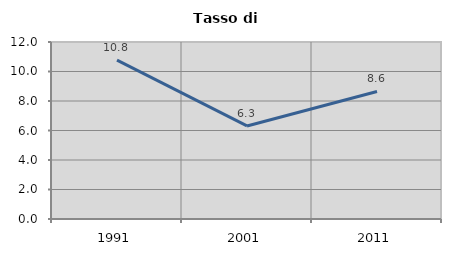
| Category | Tasso di disoccupazione   |
|---|---|
| 1991.0 | 10.769 |
| 2001.0 | 6.308 |
| 2011.0 | 8.645 |